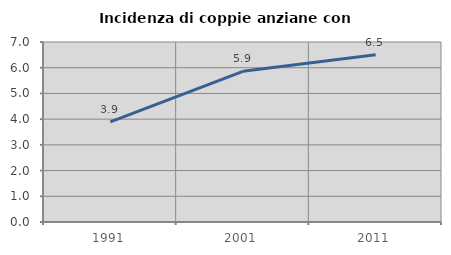
| Category | Incidenza di coppie anziane con figli |
|---|---|
| 1991.0 | 3.897 |
| 2001.0 | 5.86 |
| 2011.0 | 6.507 |